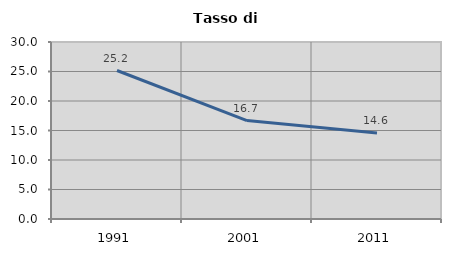
| Category | Tasso di disoccupazione   |
|---|---|
| 1991.0 | 25.169 |
| 2001.0 | 16.685 |
| 2011.0 | 14.586 |